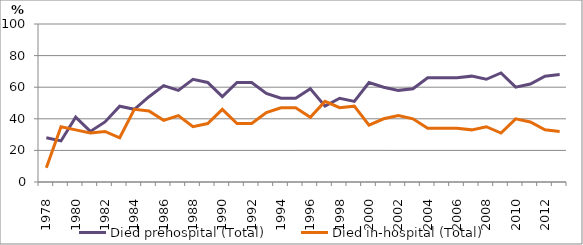
| Category | Died prehospital (Total) | Died in-hospital (Total) |
|---|---|---|
| 1978.0 | 28 | 9 |
| 1979.0 | 26 | 35 |
| 1980.0 | 41 | 33 |
| 1981.0 | 32 | 31 |
| 1982.0 | 38 | 32 |
| 1983.0 | 48 | 28 |
| 1984.0 | 46 | 46 |
| 1985.0 | 54 | 45 |
| 1986.0 | 61 | 39 |
| 1987.0 | 58 | 42 |
| 1988.0 | 65 | 35 |
| 1989.0 | 63 | 37 |
| 1990.0 | 54 | 46 |
| 1991.0 | 63 | 37 |
| 1992.0 | 63 | 37 |
| 1993.0 | 56 | 44 |
| 1994.0 | 53 | 47 |
| 1995.0 | 53 | 47 |
| 1996.0 | 59 | 41 |
| 1997.0 | 48 | 51 |
| 1998.0 | 53 | 47 |
| 1999.0 | 51 | 48 |
| 2000.0 | 63 | 36 |
| 2001.0 | 60 | 40 |
| 2002.0 | 58 | 42 |
| 2003.0 | 59 | 40 |
| 2004.0 | 66 | 34 |
| 2005.0 | 66 | 34 |
| 2006.0 | 66 | 34 |
| 2007.0 | 67 | 33 |
| 2008.0 | 65 | 35 |
| 2009.0 | 69 | 31 |
| 2010.0 | 60 | 40 |
| 2011.0 | 62 | 38 |
| 2012.0 | 67 | 33 |
| 2013.0 | 68 | 32 |